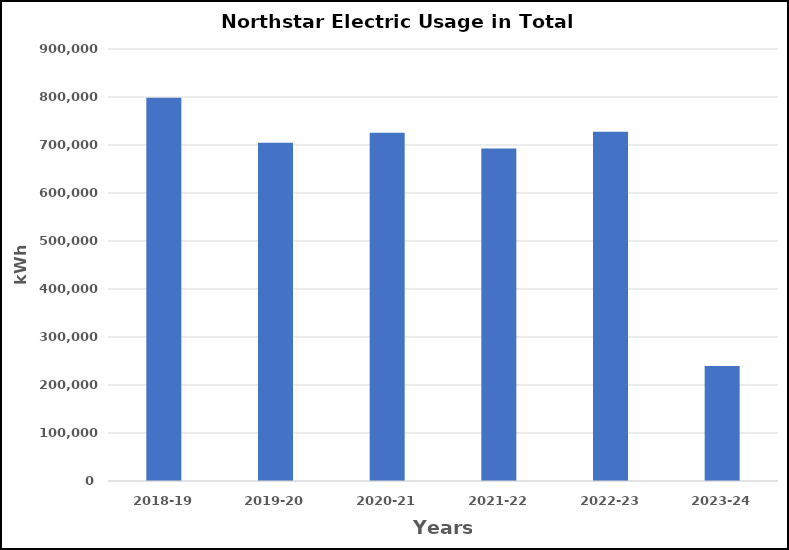
| Category | Series 0 |
|---|---|
| 2018-19 | 798505 |
| 2019-20 | 704504 |
| 2020-21 | 725673 |
| 2021-22 | 692558 |
| 2022-23 | 727359 |
| 2023-24 | 239800 |